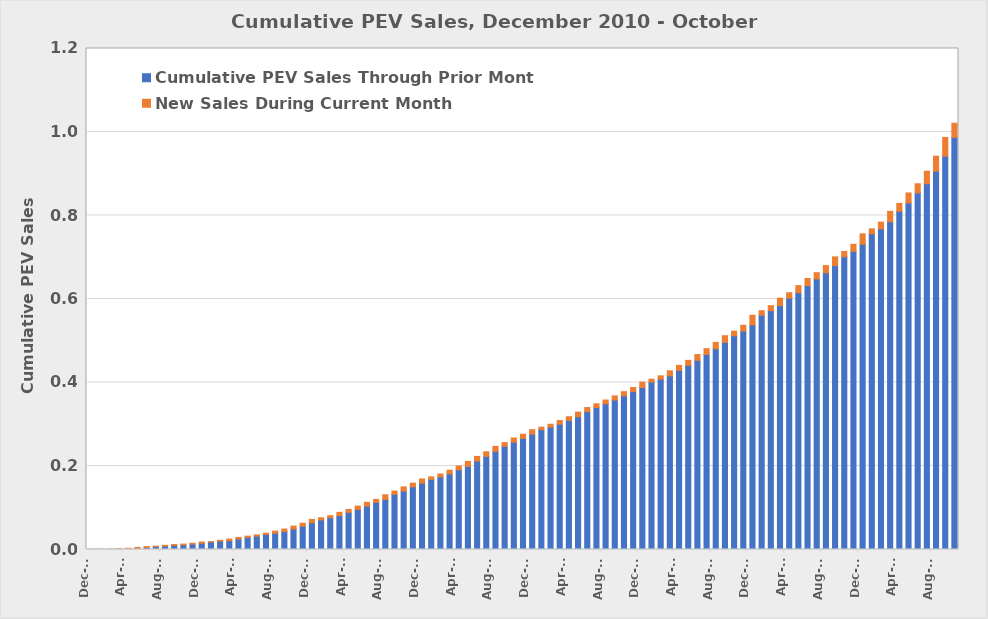
| Category | Cumulative PEV Sales Through Prior Month | New Sales During Current Month |
|---|---|---|
| 2010-12-01 | 0.3 | 0.3 |
| 2011-01-01 | 0.4 | 0.4 |
| 2011-02-01 | 0.4 | 0.4 |
| 2011-03-01 | 0.9 | 0.9 |
| 2011-04-01 | 2 | 1 |
| 2011-05-01 | 3 | 2 |
| 2011-06-01 | 5 | 2 |
| 2011-07-01 | 7 | 1 |
| 2011-08-01 | 8 | 2 |
| 2011-09-01 | 10 | 2 |
| 2011-10-01 | 11 | 2 |
| 2011-11-01 | 13 | 2 |
| 2011-12-01 | 15 | 3 |
| 2012-01-01 | 18 | 1 |
| 2012-02-01 | 20 | 2 |
| 2012-03-01 | 21 | 4 |
| 2012-04-01 | 25 | 4 |
| 2012-05-01 | 29 | 3 |
| 2012-06-01 | 32 | 3 |
| 2012-07-01 | 36 | 3 |
| 2012-08-01 | 39 | 5 |
| 2012-09-01 | 43 | 6 |
| 2012-10-01 | 49 | 7 |
| 2012-11-01 | 56 | 7 |
| 2012-12-01 | 64 | 8 |
| 2013-01-01 | 71 | 5 |
| 2013-02-01 | 76 | 5 |
| 2013-03-01 | 81 | 8 |
| 2013-04-01 | 89 | 7 |
| 2013-05-01 | 96 | 8 |
| 2013-06-01 | 104 | 9 |
| 2013-07-01 | 113 | 7 |
| 2013-08-01 | 120 | 11 |
| 2013-09-01 | 132 | 8 |
| 2013-10-01 | 140 | 10 |
| 2013-11-01 | 150 | 9 |
| 2013-12-01 | 159 | 10 |
| 2014-01-01 | 168 | 6 |
| 2014-02-01 | 174 | 7 |
| 2014-03-01 | 181 | 9 |
| 2014-04-01 | 191 | 9 |
| 2014-05-01 | 199 | 12 |
| 2014-06-01 | 212 | 11 |
| 2014-07-01 | 223 | 11 |
| 2014-08-01 | 235 | 12 |
| 2014-09-01 | 247 | 9 |
| 2014-10-01 | 257 | 10 |
| 2014-11-01 | 266 | 10 |
| 2014-12-01 | 276 | 11 |
| 2015-01-01 | 287 | 6 |
| 2015-02-01 | 293 | 7 |
| 2015-03-01 | 300 | 9 |
| 2015-04-01 | 309 | 9 |
| 2015-05-01 | 318 | 11 |
| 2015-06-01 | 330 | 10 |
| 2015-07-01 | 340 | 9 |
| 2015-08-01 | 349 | 9 |
| 2015-09-01 | 358 | 10 |
| 2015-10-01 | 368 | 10 |
| 2015-11-01 | 378 | 10 |
| 2015-12-01 | 388 | 13 |
| 2016-01-01 | 401 | 7 |
| 2016-02-01 | 408 | 8 |
| 2016-03-01 | 416 | 12 |
| 2016-04-01 | 429 | 12 |
| 2016-05-01 | 441 | 12 |
| 2016-06-01 | 453 | 14 |
| 2016-07-01 | 467 | 14 |
| 2016-08-01 | 481 | 15 |
| 2016-09-01 | 496 | 16 |
| 2016-10-01 | 512 | 11 |
| 2016-11-01 | 523 | 14 |
| 2016-12-01 | 538 | 23 |
| 2017-01-01 | 561 | 11 |
| 2017-02-01 | 572 | 12 |
| 2017-03-01 | 584 | 18 |
| 2017-04-01 | 602 | 13 |
| 2017-05-01 | 615 | 17 |
| 2017-06-01 | 632 | 17 |
| 2017-07-01 | 648 | 15 |
| 2017-08-01 | 663 | 17 |
| 2017-09-01 | 680 | 21 |
| 2017-10-01 | 701 | 13 |
| 2017-11-01 | 714 | 17 |
| 2017-12-01 | 731 | 25 |
| 2018-01-01 | 756 | 12 |
| 2018-02-01 | 768 | 16 |
| 2018-03-01 | 785 | 25 |
| 2018-04-01 | 810 | 19 |
| 2018-05-01 | 830 | 24 |
| 2018-06-01 | 854 | 22 |
| 2018-07-01 | 876 | 30 |
| 2018-08-01 | 906 | 36 |
| 2018-09-01 | 942 | 45 |
| 2018-10-01 | 987 | 34 |